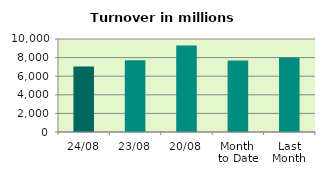
| Category | Series 0 |
|---|---|
| 24/08 | 7048.787 |
| 23/08 | 7703.334 |
| 20/08 | 9305.735 |
| Month 
to Date | 7698.227 |
| Last
Month | 8019.786 |